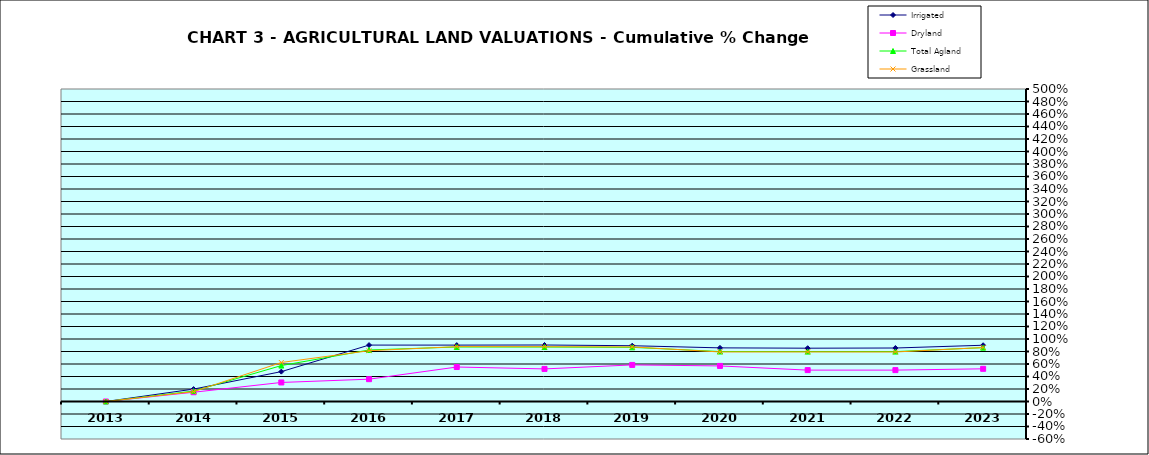
| Category | Irrigated | Dryland | Total Agland | Grassland |
|---|---|---|---|---|
| 2013.0 | 0 | 0 | 0 | 0 |
| 2014.0 | 0.198 | 0.148 | 0.167 | 0.157 |
| 2015.0 | 0.478 | 0.305 | 0.575 | 0.624 |
| 2016.0 | 0.903 | 0.357 | 0.824 | 0.812 |
| 2017.0 | 0.902 | 0.552 | 0.872 | 0.878 |
| 2018.0 | 0.904 | 0.521 | 0.872 | 0.877 |
| 2019.0 | 0.892 | 0.585 | 0.867 | 0.873 |
| 2020.0 | 0.858 | 0.569 | 0.8 | 0.793 |
| 2021.0 | 0.853 | 0.502 | 0.798 | 0.793 |
| 2022.0 | 0.856 | 0.502 | 0.798 | 0.792 |
| 2023.0 | 0.9 | 0.523 | 0.861 | 0.864 |